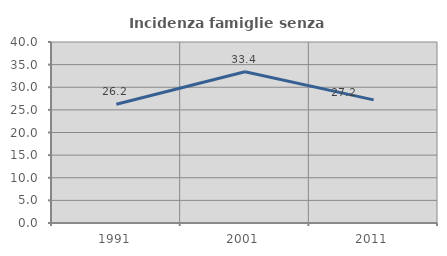
| Category | Incidenza famiglie senza nuclei |
|---|---|
| 1991.0 | 26.239 |
| 2001.0 | 33.413 |
| 2011.0 | 27.208 |